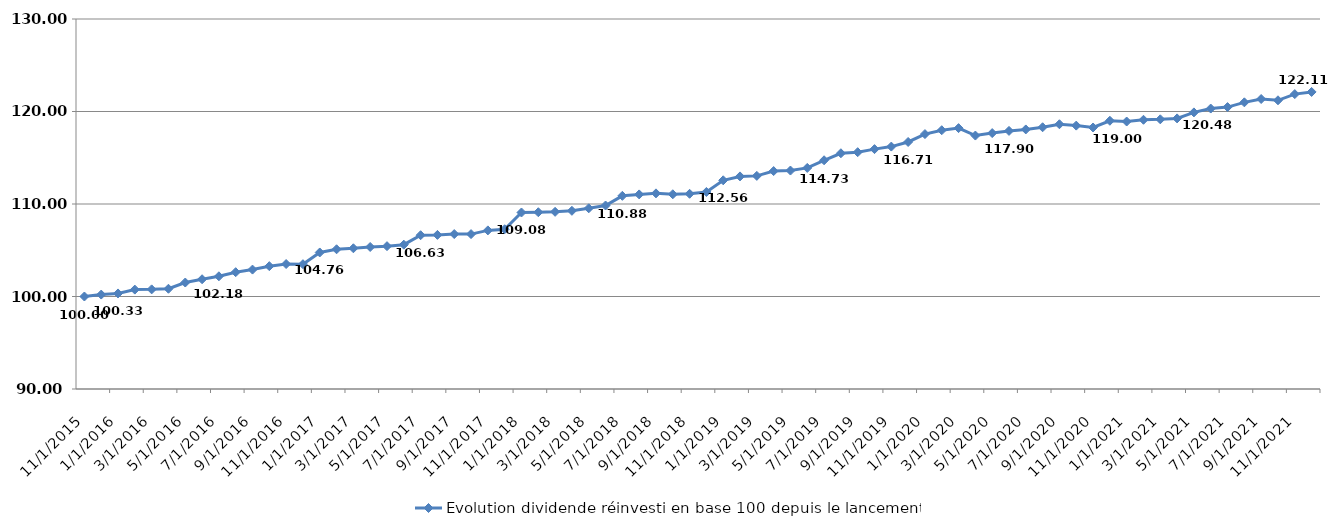
| Category |  Evolution dividende réinvesti en base 100 depuis le lancement  |
|---|---|
| 11/2/15 | 100 |
| 12/1/15 | 100.208 |
| 1/1/16 | 100.33 |
| 2/1/16 | 100.746 |
| 3/1/16 | 100.771 |
| 4/1/16 | 100.837 |
| 5/1/16 | 101.51 |
| 6/1/16 | 101.866 |
| 7/1/16 | 102.184 |
| 8/1/16 | 102.628 |
| 9/1/16 | 102.91 |
| 10/1/16 | 103.279 |
| 11/1/16 | 103.512 |
| 12/1/16 | 103.493 |
| 1/1/17 | 104.76 |
| 2/1/17 | 105.106 |
| 3/1/17 | 105.214 |
| 4/1/17 | 105.352 |
| 5/1/17 | 105.442 |
| 6/1/17 | 105.604 |
| 7/1/17 | 106.626 |
| 8/1/17 | 106.66 |
| 9/1/17 | 106.751 |
| 10/1/17 | 106.745 |
| 11/1/17 | 107.146 |
| 12/1/17 | 107.271 |
| 1/1/18 | 109.081 |
| 2/1/18 | 109.111 |
| 3/1/18 | 109.152 |
| 4/1/18 | 109.263 |
| 5/1/18 | 109.536 |
| 6/1/18 | 109.837 |
| 7/1/18 | 110.882 |
| 8/1/18 | 111.037 |
| 9/1/18 | 111.15 |
| 10/1/18 | 111.052 |
| 11/1/18 | 111.102 |
| 12/1/18 | 111.299 |
| 1/1/19 | 112.564 |
| 2/1/19 | 112.982 |
| 3/1/19 | 113.04 |
| 4/1/19 | 113.559 |
| 5/1/19 | 113.618 |
| 6/1/19 | 113.902 |
| 7/1/19 | 114.727 |
| 8/1/19 | 115.485 |
| 9/1/19 | 115.601 |
| 10/1/19 | 115.933 |
| 11/1/19 | 116.208 |
| 12/1/19 | 116.705 |
| 1/1/20 | 117.558 |
| 2/1/20 | 117.976 |
| 3/1/20 | 118.204 |
| 4/1/20 | 117.4 |
| 5/1/20 | 117.666 |
| 6/1/20 | 117.902 |
| 7/1/20 | 118.06 |
| 8/1/20 | 118.297 |
| 9/1/20 | 118.622 |
| 10/1/20 | 118.474 |
| 11/1/20 | 118.271 |
| 12/1/20 | 119 |
| 1/1/21 | 118.917 |
| 2/1/21 | 119.105 |
| 3/1/21 | 119.156 |
| 4/1/21 | 119.254 |
| 5/1/21 | 119.903 |
| 6/1/21 | 120.32 |
| 7/1/21 | 120.479 |
| 8/1/21 | 120.99 |
| 9/1/21 | 121.35 |
| 10/1/21 | 121.213 |
| 11/1/21 | 121.881 |
| 12/1/21 | 122.114 |